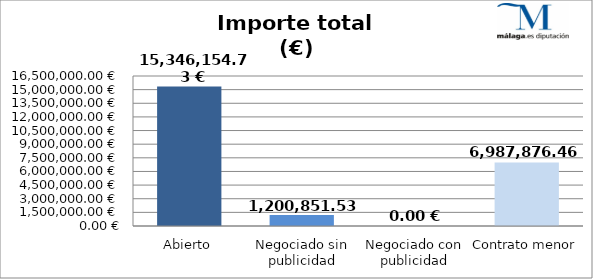
| Category | Importe total |
|---|---|
| Abierto | 15346154.73 |
| Negociado sin publicidad | 1200851.53 |
| Negociado con publicidad | 0 |
| Contrato menor | 6987876.46 |